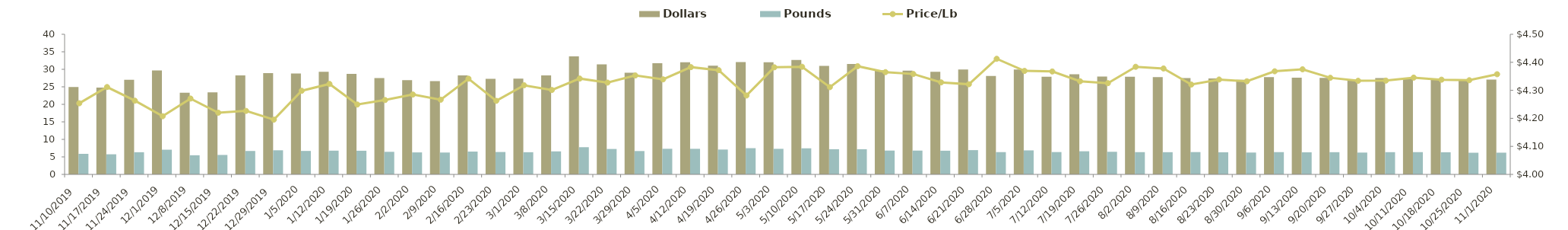
| Category | Dollars | Pounds |
|---|---|---|
| 11/10/19 | 24956007.17 | 5866750.21 |
| 11/17/19 | 24763521.5 | 5743310.4 |
| 11/24/19 | 26990869.48 | 6331300.32 |
| 12/1/19 | 29669581.21 | 7051383.39 |
| 12/8/19 | 23335743.43 | 5464173.83 |
| 12/15/19 | 23432627.32 | 5552574.29 |
| 12/22/19 | 28280878.21 | 6691221.8 |
| 12/29/19 | 28898346.65 | 6888124.92 |
| 1/5/20 | 28814053.36 | 6703499.05 |
| 1/12/20 | 29298660.1 | 6777543.73 |
| 1/19/20 | 28707634.24 | 6755795.46 |
| 1/26/20 | 27494172.27 | 6445890.98 |
| 2/2/20 | 26909074.67 | 6279866.79 |
| 2/9/20 | 26632966.59 | 6242247.14 |
| 2/16/20 | 28284555.19 | 6514925.37 |
| 2/23/20 | 27259695.5 | 6395161.78 |
| 3/1/20 | 27337134.33 | 6330852 |
| 3/8/20 | 28261990.94 | 6570768.6 |
| 3/15/20 | 33720950.32 | 7766262.78 |
| 3/22/20 | 31417448.65 | 7259780.91 |
| 3/29/20 | 29031312.02 | 6669221.68 |
| 4/5/20 | 31731321.67 | 7312763.09 |
| 4/12/20 | 32021373.51 | 7306249.09 |
| 4/19/20 | 31026273.86 | 7096794.18 |
| 4/26/20 | 32072816.08 | 7490988.51 |
| 5/3/20 | 31993009.43 | 7300725.01 |
| 5/10/20 | 32652299.06 | 7447961.88 |
| 5/17/20 | 30975102.03 | 7184630.44 |
| 5/24/20 | 31506128.73 | 7183321.49 |
| 5/31/20 | 29711299.73 | 6806779.41 |
| 6/7/20 | 29632310.97 | 6798952.79 |
| 6/14/20 | 29269470.6 | 6762407.47 |
| 6/21/20 | 29962685.8 | 6933094.21 |
| 6/28/20 | 28076203.19 | 6362894.35 |
| 7/5/20 | 29964383.55 | 6857920.71 |
| 7/12/20 | 27856982.23 | 6378625.67 |
| 7/19/20 | 28613883.11 | 6604692.03 |
| 7/26/20 | 27932814.07 | 6457586.72 |
| 8/2/20 | 27858665.51 | 6354647.4 |
| 8/9/20 | 27747217.33 | 6337912.75 |
| 8/16/20 | 27520005.58 | 6369459.14 |
| 8/23/20 | 27395740.53 | 6314474.53 |
| 8/30/20 | 27030748.36 | 6239472.92 |
| 9/6/20 | 27773200.52 | 6358437.61 |
| 9/13/20 | 27605315.05 | 6309730.37 |
| 9/20/20 | 27535225.48 | 6337644.32 |
| 9/27/20 | 27011399.12 | 6232316.76 |
| 10/4/20 | 27512619.15 | 6347117.75 |
| 10/11/20 | 27624084.15 | 6357133.29 |
| 10/18/20 | 27399933.79 | 6316356.53 |
| 10/25/20 | 26821154.01 | 6185612.94 |
| 11/1/20 | 27043076.46 | 6206174.21 |